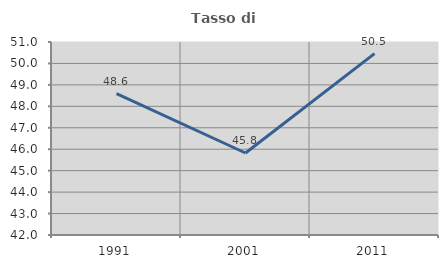
| Category | Tasso di occupazione   |
|---|---|
| 1991.0 | 48.592 |
| 2001.0 | 45.824 |
| 2011.0 | 50.458 |